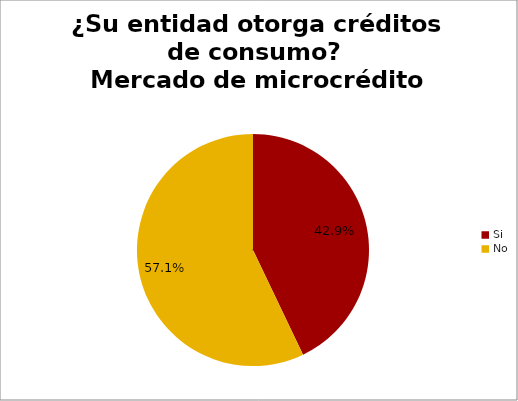
| Category | ¿Su entidad otorga créditos de consumo? Mercado de microcrédito |
|---|---|
| Si | 0.429 |
| No | 0.571 |